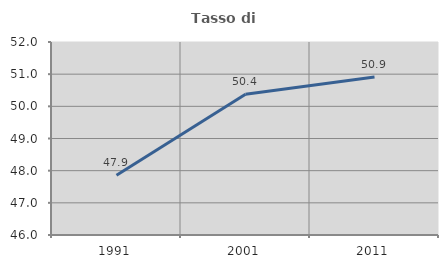
| Category | Tasso di occupazione   |
|---|---|
| 1991.0 | 47.856 |
| 2001.0 | 50.373 |
| 2011.0 | 50.914 |